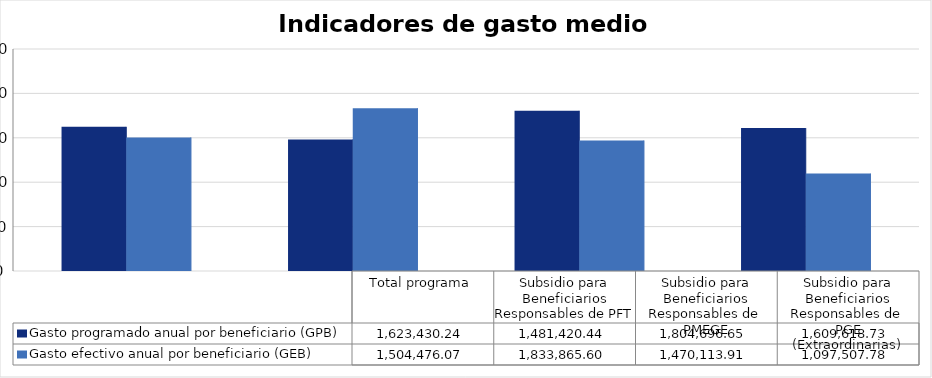
| Category | Gasto programado anual por beneficiario (GPB)  | Gasto efectivo anual por beneficiario (GEB)  |
|---|---|---|
| Total programa | 1623430.245 | 1504476.065 |
| Subsidio para Beneficiarios Responsables de PFT | 1481420.438 | 1833865.6 |
| Subsidio para Beneficiarios Responsables de  PMEGE | 1804696.648 | 1470113.907 |
| Subsidio para Beneficiarios Responsables de  PGE (Extraordinarias) | 1609618.726 | 1097507.781 |